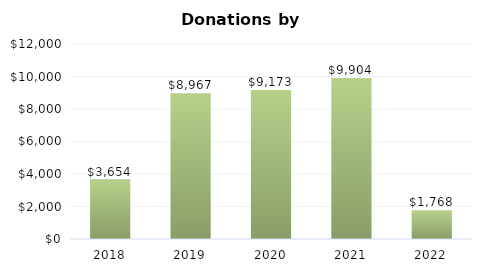
| Category | Donations |
|---|---|
| 2018.0 | 3654 |
| 2019.0 | 8967 |
| 2020.0 | 9173 |
| 2021.0 | 9904 |
| 2022.0 | 1768 |